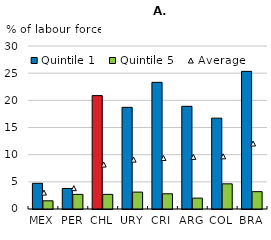
| Category | Quintile 1 | Quintile 5 |
|---|---|---|
| MEX | 4.73 | 1.51 |
| PER | 3.78 | 2.69 |
| CHL | 20.87 | 2.69 |
| URY | 18.71 | 3.11 |
| CRI | 23.31 | 2.8 |
| ARG | 18.9 | 2 |
| COL | 16.72 | 4.63 |
| BRA | 25.33 | 3.19 |